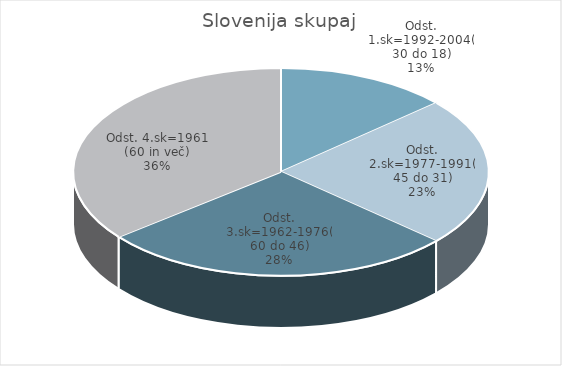
| Category | Slovenija skupaj |
|---|---|
| Odst. 1.sk=1992-2004(30 do 18) | 9.36 |
| Odst. 2.sk=1977-1991(45 do 31) | 16.16 |
| Odst. 3.sk=1962-1976(60 do 46) | 19.25 |
| Odst. 4.sk=1961 (60 in več) | 24.93 |